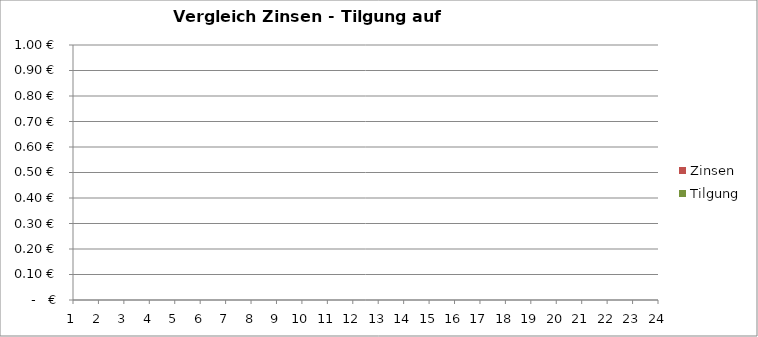
| Category | Tilgung | Zinsen |
|---|---|---|
| 0 | 0 | 0 |
| 1 | 0 | 0 |
| 2 | 0 | 0 |
| 3 | 0 | 0 |
| 4 | 0 | 0 |
| 5 | 0 | 0 |
| 6 | 0 | 0 |
| 7 | 0 | 0 |
| 8 | 0 | 0 |
| 9 | 0 | 0 |
| 10 | 0 | 0 |
| 11 | 0 | 0 |
| 12 | 0 | 0 |
| 13 | 0 | 0 |
| 14 | 0 | 0 |
| 15 | 0 | 0 |
| 16 | 0 | 0 |
| 17 | 0 | 0 |
| 18 | 0 | 0 |
| 19 | 0 | 0 |
| 20 | 0 | 0 |
| 21 | 0 | 0 |
| 22 | 0 | 0 |
| 23 | 0 | 0 |